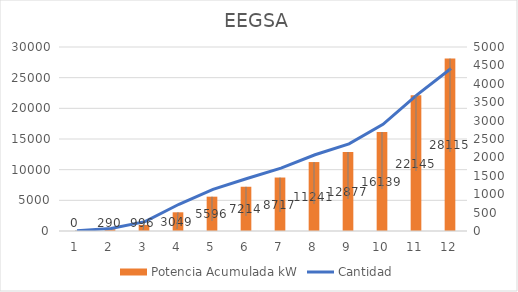
| Category | Potencia Acumulada kW |
|---|---|
| 0 | 0 |
| 1 | 290 |
| 2 | 996 |
| 3 | 3049 |
| 4 | 5596 |
| 5 | 7214 |
| 6 | 8717 |
| 7 | 11241 |
| 8 | 12877 |
| 9 | 16139 |
| 10 | 22145 |
| 11 | 28115 |